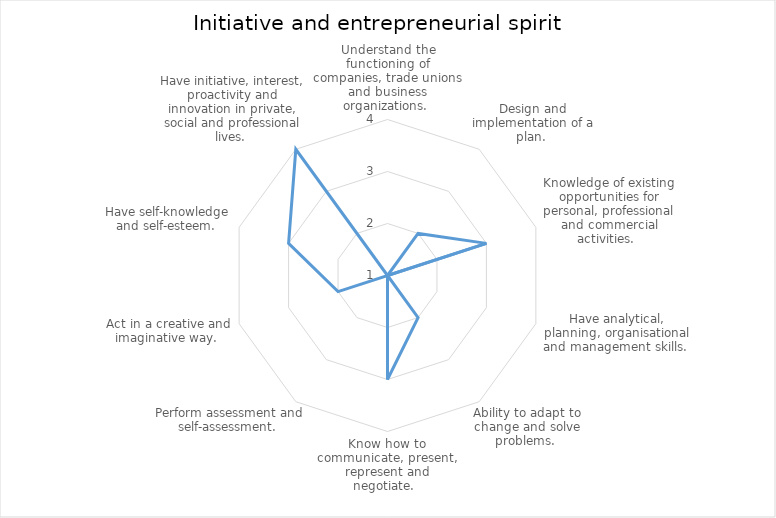
| Category | Series 0 |
|---|---|
| Understand the functioning of companies, trade unions and business organizations.  | 1 |
| Design and implementation of a plan.  | 2 |
| Knowledge of existing opportunities for personal, professional and commercial activities.   | 3 |
| Have analytical, planning, organisational and management skills.  | 1 |
| Ability to adapt to change and solve problems.  | 2 |
| Know how to communicate, present, represent and negotiate.   | 3 |
| Perform assessment and self-assessment.  | 1 |
| Act in a creative and imaginative way.  | 2 |
| Have self-knowledge and self-esteem.  | 3 |
| Have initiative, interest, proactivity and innovation in private, social and professional lives.  | 4 |